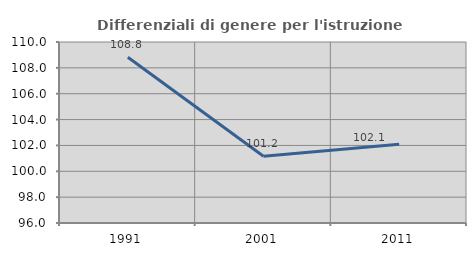
| Category | Differenziali di genere per l'istruzione superiore |
|---|---|
| 1991.0 | 108.818 |
| 2001.0 | 101.168 |
| 2011.0 | 102.099 |